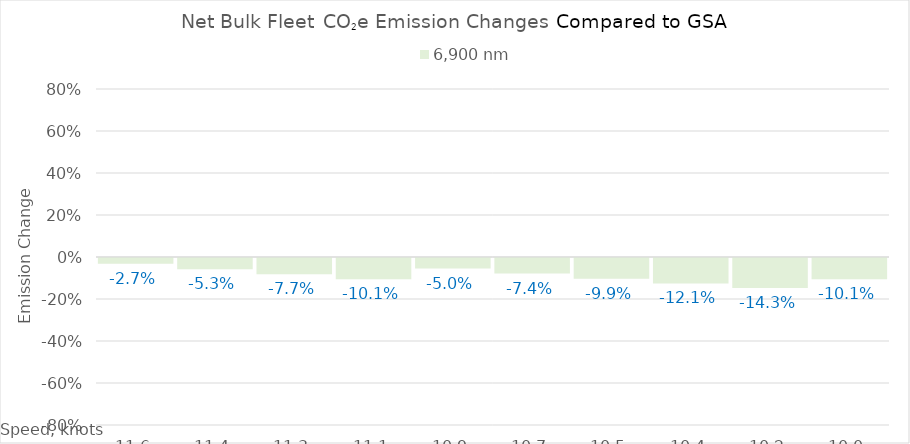
| Category | 6,900 |
|---|---|
| 11.620000000000001 | -0.027 |
| 11.440000000000001 | -0.053 |
| 11.260000000000002 | -0.077 |
| 11.080000000000002 | -0.101 |
| 10.900000000000002 | -0.05 |
| 10.720000000000002 | -0.074 |
| 10.540000000000003 | -0.099 |
| 10.360000000000003 | -0.121 |
| 10.180000000000003 | -0.143 |
| 10.000000000000004 | -0.101 |